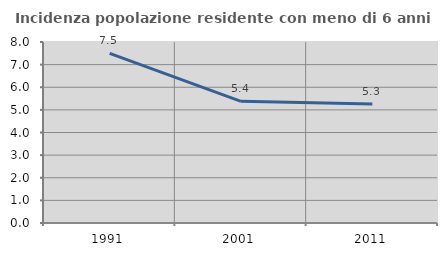
| Category | Incidenza popolazione residente con meno di 6 anni |
|---|---|
| 1991.0 | 7.496 |
| 2001.0 | 5.378 |
| 2011.0 | 5.254 |